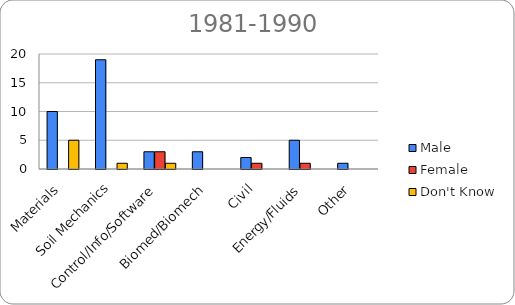
| Category | Male | Female | Don't Know |
|---|---|---|---|
| Materials | 10 | 0 | 5 |
| Soil Mechanics | 19 | 0 | 1 |
| Control/Info/Software | 3 | 3 | 1 |
| Biomed/Biomech | 3 | 0 | 0 |
| Civil | 2 | 1 | 0 |
| Energy/Fluids | 5 | 1 | 0 |
| Other | 1 | 0 | 0 |